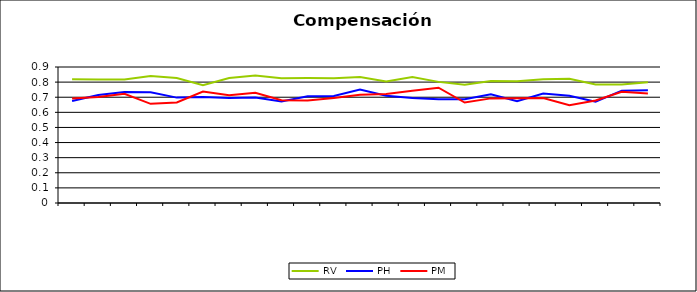
| Category | RV | PH | PM |
|---|---|---|---|
| 0 | 0.819 | 0.675 | 0.691 |
| 1 | 0.818 | 0.714 | 0.701 |
| 2 | 0.817 | 0.734 | 0.722 |
| 3 | 0.84 | 0.732 | 0.656 |
| 4 | 0.827 | 0.697 | 0.666 |
| 5 | 0.78 | 0.701 | 0.737 |
| 6 | 0.827 | 0.695 | 0.713 |
| 7 | 0.844 | 0.699 | 0.73 |
| 8 | 0.826 | 0.672 | 0.68 |
| 9 | 0.827 | 0.706 | 0.678 |
| 10 | 0.826 | 0.709 | 0.696 |
| 11 | 0.834 | 0.751 | 0.717 |
| 12 | 0.804 | 0.709 | 0.721 |
| 13 | 0.834 | 0.694 | 0.743 |
| 14 | 0.802 | 0.687 | 0.763 |
| 15 | 0.783 | 0.687 | 0.665 |
| 16 | 0.807 | 0.72 | 0.692 |
| 17 | 0.805 | 0.674 | 0.693 |
| 18 | 0.82 | 0.724 | 0.695 |
| 19 | 0.822 | 0.71 | 0.646 |
| 20 | 0.784 | 0.67 | 0.678 |
| 21 | 0.785 | 0.743 | 0.736 |
| 22 | 0.8 | 0.745 | 0.725 |